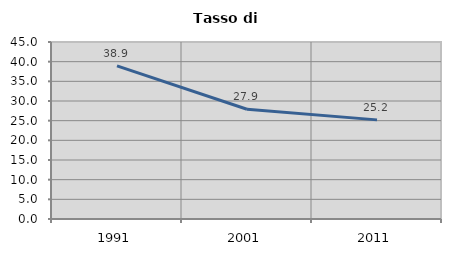
| Category | Tasso di disoccupazione   |
|---|---|
| 1991.0 | 38.92 |
| 2001.0 | 27.893 |
| 2011.0 | 25.2 |